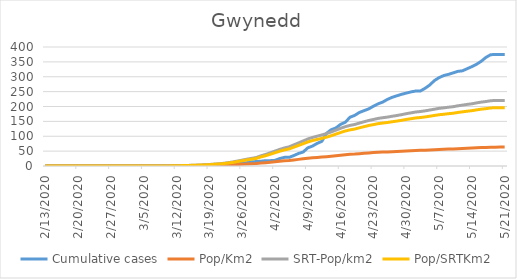
| Category | Cumulative cases | Pop/Km2 | SRT-Pop/km2 | Pop/SRTKm2 |
|---|---|---|---|---|
| 5/21/20 | 375 | 63.454 | 220.515 | 196.179 |
| 5/20/20 | 375 | 63.454 | 220.515 | 196.179 |
| 5/19/20 | 375 | 63.439 | 220.464 | 196.133 |
| 5/18/20 | 374 | 63.091 | 219.255 | 195.058 |
| 5/17/20 | 365 | 62.351 | 216.682 | 192.769 |
| 5/16/20 | 352 | 61.799 | 214.766 | 191.064 |
| 5/15/20 | 342 | 61.024 | 212.072 | 188.667 |
| 5/14/20 | 334 | 60.164 | 209.085 | 186.01 |
| 5/13/20 | 327 | 59.568 | 207.013 | 184.166 |
| 5/12/20 | 320 | 58.883 | 204.63 | 182.047 |
| 5/11/20 | 318 | 58.202 | 202.264 | 179.942 |
| 5/10/20 | 313 | 57.357 | 199.329 | 177.331 |
| 5/9/20 | 308 | 56.865 | 197.62 | 175.81 |
| 5/8/20 | 304 | 56.249 | 195.478 | 173.905 |
| 5/7/20 | 297 | 55.752 | 193.752 | 172.369 |
| 5/6/20 | 287 | 54.933 | 190.903 | 169.834 |
| 5/5/20 | 272 | 54.113 | 188.054 | 167.3 |
| 5/4/20 | 261 | 53.323 | 185.308 | 164.857 |
| 5/3/20 | 252 | 52.687 | 183.098 | 162.891 |
| 5/2/20 | 252 | 52.22 | 181.475 | 161.447 |
| 5/1/20 | 249 | 51.39 | 178.591 | 158.882 |
| 4/30/20 | 245 | 50.605 | 175.863 | 156.455 |
| 4/29/20 | 241 | 49.651 | 172.548 | 153.505 |
| 4/28/20 | 236 | 48.841 | 169.734 | 151.001 |
| 4/27/20 | 231 | 48.116 | 167.213 | 148.759 |
| 4/26/20 | 224 | 47.301 | 164.381 | 146.239 |
| 4/25/20 | 215 | 46.71 | 162.326 | 144.411 |
| 4/24/20 | 209 | 46.039 | 159.995 | 142.338 |
| 4/23/20 | 201 | 45.01 | 156.421 | 139.158 |
| 4/22/20 | 192 | 44.027 | 153.002 | 136.116 |
| 4/21/20 | 186 | 42.779 | 148.668 | 132.261 |
| 4/20/20 | 180 | 41.522 | 144.299 | 128.374 |
| 4/19/20 | 170 | 40.156 | 139.551 | 124.15 |
| 4/18/20 | 164 | 39.272 | 136.478 | 121.416 |
| 4/17/20 | 147 | 38.064 | 132.282 | 117.683 |
| 4/16/20 | 140 | 36.464 | 126.722 | 112.736 |
| 4/15/20 | 128 | 34.681 | 120.523 | 107.222 |
| 4/14/20 | 122 | 32.917 | 114.393 | 101.768 |
| 4/13/20 | 110 | 31.377 | 109.04 | 97.006 |
| 4/12/20 | 83 | 30.05 | 104.43 | 92.905 |
| 4/11/20 | 76 | 28.843 | 100.234 | 89.172 |
| 4/10/20 | 67 | 27.63 | 96.021 | 85.424 |
| 4/9/20 | 61 | 26.14 | 90.841 | 80.816 |
| 4/8/20 | 47 | 24.202 | 84.107 | 74.825 |
| 4/7/20 | 42 | 22.299 | 77.494 | 68.941 |
| 4/6/20 | 35 | 20.431 | 71.001 | 63.166 |
| 4/5/20 | 29 | 18.548 | 64.457 | 57.344 |
| 4/4/20 | 29 | 17.45 | 60.641 | 53.949 |
| 4/3/20 | 25 | 16.053 | 55.789 | 49.632 |
| 4/2/20 | 19 | 14.444 | 50.195 | 44.655 |
| 4/1/20 | 18 | 12.789 | 44.445 | 39.54 |
| 3/31/20 | 18 | 11.199 | 38.92 | 34.624 |
| 3/30/20 | 16 | 9.853 | 34.24 | 30.461 |
| 3/29/20 | 15 | 8.193 | 28.473 | 25.331 |
| 3/28/20 | 14 | 7.418 | 25.779 | 22.934 |
| 3/27/20 | 11 | 6.593 | 22.913 | 20.384 |
| 3/26/20 | 10 | 5.674 | 19.719 | 17.543 |
| 3/25/20 | 8 | 4.81 | 16.714 | 14.87 |
| 3/24/20 | 6 | 3.9 | 13.555 | 12.059 |
| 3/23/20 | 4 | 3.23 | 11.223 | 9.985 |
| 3/22/20 | 4 | 2.584 | 8.979 | 7.988 |
| 3/21/20 | 4 | 2.206 | 7.667 | 6.82 |
| 3/20/20 | 4 | 1.833 | 6.371 | 5.668 |
| 3/19/20 | 4 | 1.476 | 5.128 | 4.562 |
| 3/18/20 | 3 | 1.178 | 4.092 | 3.641 |
| 3/17/20 | 1 | 1.004 | 3.488 | 3.103 |
| 3/16/20 | 1 | 0.82 | 2.849 | 2.535 |
| 3/15/20 | 0 | 0.651 | 2.262 | 2.012 |
| 3/14/20 | 0 | 0.507 | 1.761 | 1.567 |
| 3/13/20 | 0 | 0.412 | 1.433 | 1.275 |
| 3/12/20 | 0 | 0.278 | 0.967 | 0.86 |
| 3/11/20 | 0 | 0.159 | 0.553 | 0.492 |
| 3/10/20 | 0 | 0.089 | 0.311 | 0.277 |
| 3/9/20 | 0 | 0.035 | 0.121 | 0.108 |
| 3/8/20 | 0 | 0.02 | 0.069 | 0.061 |
| 3/7/20 | 0 | 0.02 | 0.069 | 0.061 |
| 3/6/20 | 0 | 0.01 | 0.035 | 0.031 |
| 3/5/20 | 0 | 0.01 | 0.035 | 0.031 |
| 3/4/20 | 0 | 0.01 | 0.035 | 0.031 |
| 3/3/20 | 0 | 0.005 | 0.017 | 0.015 |
| 3/2/20 | 0 | 0.005 | 0.017 | 0.015 |
| 3/1/20 | 0 | 0.005 | 0.017 | 0.015 |
| 2/29/20 | 0 | 0.005 | 0.017 | 0.015 |
| 2/28/20 | 0 | 0.005 | 0.017 | 0.015 |
| 2/27/20 | 0 | 0.005 | 0.017 | 0.015 |
| 2/26/20 | 0 | 0 | 0 | 0 |
| 2/25/20 | 0 | 0 | 0 | 0 |
| 2/24/20 | 0 | 0 | 0 | 0 |
| 2/23/20 | 0 | 0 | 0 | 0 |
| 2/22/20 | 0 | 0 | 0 | 0 |
| 2/21/20 | 0 | 0 | 0 | 0 |
| 2/20/20 | 0 | 0 | 0 | 0 |
| 2/19/20 | 0 | 0 | 0 | 0 |
| 2/18/20 | 0 | 0 | 0 | 0 |
| 2/17/20 | 0 | 0 | 0 | 0 |
| 2/16/20 | 0 | 0 | 0 | 0 |
| 2/15/20 | 0 | 0 | 0 | 0 |
| 2/14/20 | 0 | 0 | 0 | 0 |
| 2/13/20 | 0 | 0 | 0 | 0 |